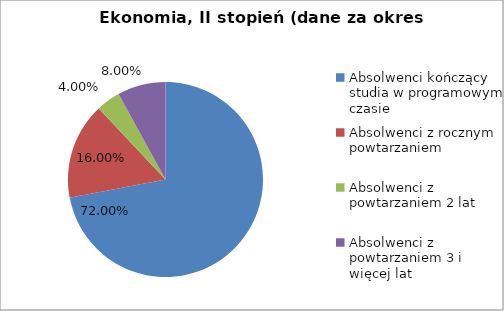
| Category | Series 0 |
|---|---|
| Absolwenci kończący studia w programowym czasie | 72 |
| Absolwenci z rocznym powtarzaniem | 16 |
| Absolwenci z powtarzaniem 2 lat | 4 |
| Absolwenci z powtarzaniem 3 i więcej lat | 8 |